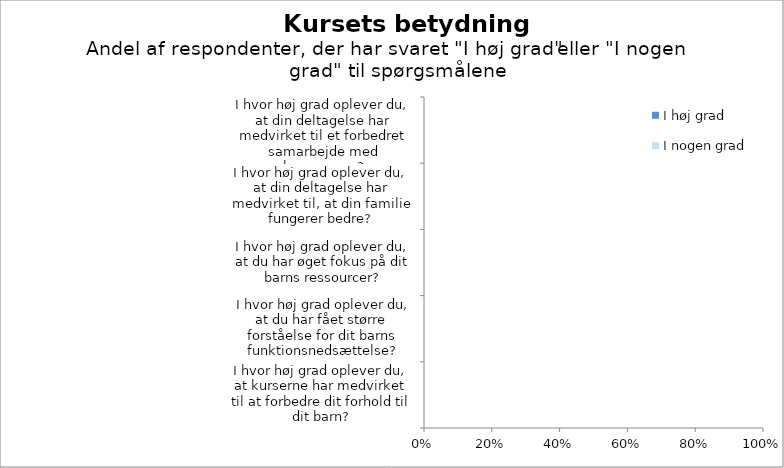
| Category | I høj grad | I nogen grad |
|---|---|---|
| I hvor høj grad oplever du, at kurserne har medvirket til at forbedre dit forhold til dit barn? | 0 | 0 |
|  I hvor høj grad oplever du, at du har fået større forståelse for dit barns funktionsnedsættelse? | 0 | 0 |
| I hvor høj grad oplever du, at du har øget fokus på dit barns ressourcer? | 0 | 0 |
| I hvor høj grad oplever du, at din deltagelse har medvirket til, at din familie fungerer bedre? | 0 | 0 |
| I hvor høj grad oplever du, at din deltagelse har medvirket til et forbedret samarbejde med kommunen? | 0 | 0 |